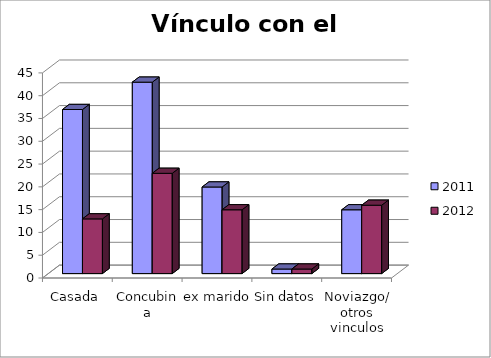
| Category | 2011 | 2012 |
|---|---|---|
| Casada | 36 | 12 |
| Concubina | 42 | 22 |
| ex marido | 19 | 14 |
| Sin datos | 1 | 1 |
| Noviazgo/ otros vinculos | 14 | 15 |